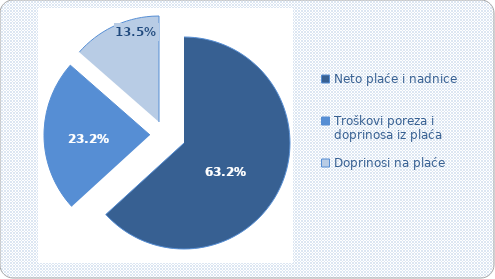
| Category | Series 0 |
|---|---|
| Neto plaće i nadnice | 63.217 |
| Troškovi poreza i doprinosa iz plaća | 23.237 |
| Doprinosi na plaće | 13.546 |